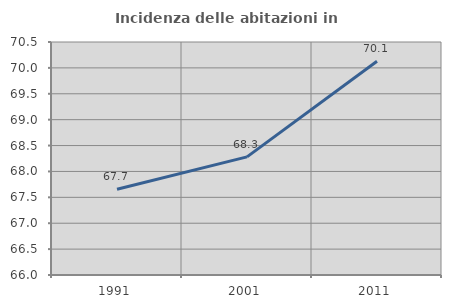
| Category | Incidenza delle abitazioni in proprietà  |
|---|---|
| 1991.0 | 67.657 |
| 2001.0 | 68.282 |
| 2011.0 | 70.127 |